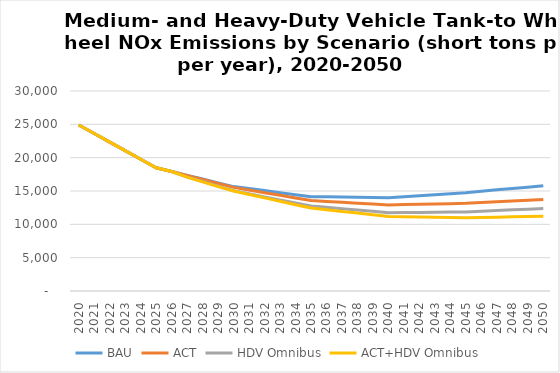
| Category | BAU | ACT | HDV Omnibus | ACT+HDV Omnibus |
|---|---|---|---|---|
| 2020.0 | 24900 | 24900 | 24900 | 24900 |
| 2021.0 | 23620 | 23620 | 23620 | 23620 |
| 2022.0 | 22330 | 22330 | 22330 | 22330 |
| 2023.0 | 21050 | 21050 | 21050 | 21050 |
| 2024.0 | 19760 | 19760 | 19760 | 19760 |
| 2025.0 | 18480 | 18480 | 18480 | 18480 |
| 2026.0 | 17920 | 17920 | 17920 | 17920 |
| 2027.0 | 17350 | 17330 | 17100 | 17080 |
| 2028.0 | 16790 | 16730 | 16420 | 16360 |
| 2029.0 | 16220 | 16140 | 15730 | 15650 |
| 2030.0 | 15660 | 15540 | 15040 | 14990 |
| 2031.0 | 15360 | 15140 | 14580 | 14480 |
| 2032.0 | 15060 | 14750 | 14120 | 13970 |
| 2033.0 | 14750 | 14350 | 13670 | 13460 |
| 2034.0 | 14450 | 13960 | 13210 | 12950 |
| 2035.0 | 14150 | 13560 | 12750 | 12440 |
| 2036.0 | 14120 | 13430 | 12550 | 12190 |
| 2037.0 | 14090 | 13300 | 12350 | 11940 |
| 2038.0 | 14050 | 13170 | 12150 | 11690 |
| 2039.0 | 14020 | 13040 | 11950 | 11440 |
| 2040.0 | 13990 | 12910 | 11750 | 11190 |
| 2041.0 | 14140 | 12960 | 11770 | 11150 |
| 2042.0 | 14290 | 13010 | 11790 | 11110 |
| 2043.0 | 14450 | 13050 | 11820 | 11070 |
| 2044.0 | 14600 | 13100 | 11840 | 11030 |
| 2045.0 | 14750 | 13150 | 11860 | 10990 |
| 2046.0 | 14960 | 13260 | 11960 | 11030 |
| 2047.0 | 15170 | 13370 | 12070 | 11080 |
| 2048.0 | 15370 | 13490 | 12170 | 11120 |
| 2049.0 | 15580 | 13600 | 12280 | 11170 |
| 2050.0 | 15790 | 13710 | 12380 | 11210 |